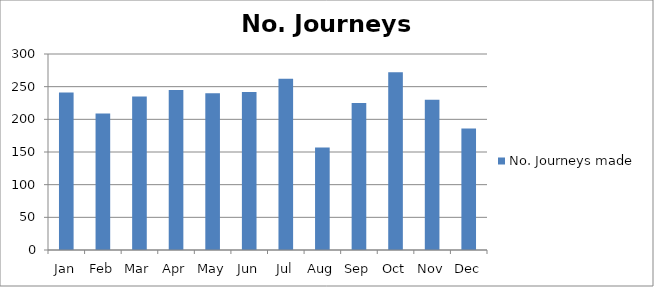
| Category | No. Journeys made |
|---|---|
| Jan | 241 |
| Feb | 209 |
| Mar | 235 |
| Apr | 245 |
| May | 240 |
| Jun | 242 |
| Jul | 262 |
| Aug | 157 |
| Sep | 225 |
| Oct | 272 |
| Nov | 230 |
| Dec | 186 |